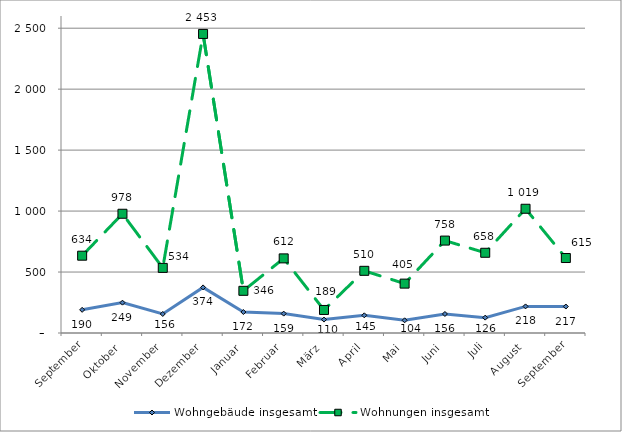
| Category | Wohngebäude insgesamt | Wohnungen insgesamt |
|---|---|---|
| September | 190 | 634 |
| Oktober | 249 | 978 |
| November | 156 | 534 |
| Dezember | 374 | 2453 |
| Januar | 172 | 346 |
| Februar | 159 | 612 |
| März | 110 | 189 |
| April | 145 | 510 |
| Mai | 104 | 405 |
| Juni | 156 | 758 |
| Juli | 126 | 658 |
| August | 218 | 1019 |
| September | 217 | 615 |